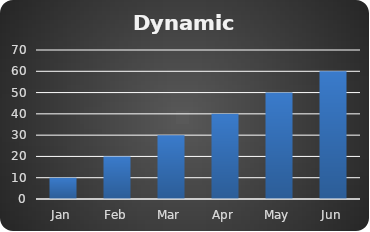
| Category | Sales |
|---|---|
| Jan | 10 |
| Feb | 20 |
| Mar | 30 |
| Apr | 40 |
| May | 50 |
| Jun | 60 |